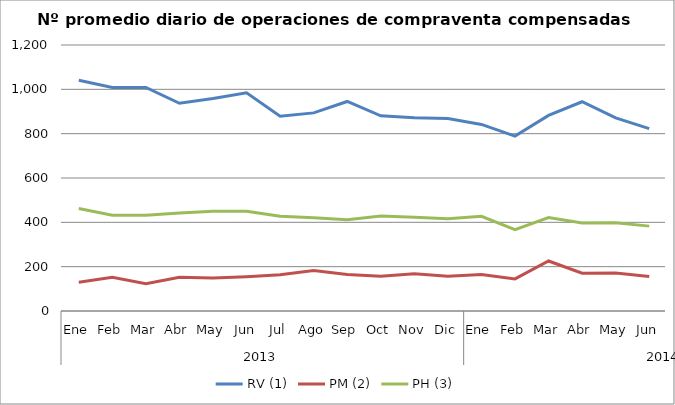
| Category | RV (1) | PM (2) | PH (3) |
|---|---|---|---|
| 0 | 1040.636 | 129.682 | 462.545 |
| 1 | 1008.7 | 152.35 | 432.05 |
| 2 | 1008.45 | 123.6 | 431.9 |
| 3 | 937.091 | 152.273 | 442.545 |
| 4 | 958.381 | 148.429 | 449.571 |
| 5 | 984.3 | 154.95 | 450 |
| 6 | 878.955 | 163.091 | 427.955 |
| 7 | 893.762 | 182.333 | 420.857 |
| 8 | 945.278 | 164.944 | 411.222 |
| 9 | 880.5 | 156.955 | 428.864 |
| 10 | 871.35 | 167.95 | 423.25 |
| 11 | 868.85 | 156.75 | 415.75 |
| 12 | 841.591 | 164.955 | 427.091 |
| 13 | 788.8 | 144.95 | 366.85 |
| 14 | 882.238 | 225.667 | 421.238 |
| 15 | 944 | 170.238 | 397.381 |
| 16 | 871.55 | 171.45 | 398.25 |
| 17 | 822.476 | 155.857 | 382.905 |